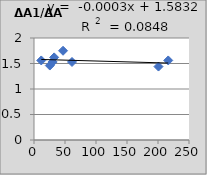
| Category | ΔA1/ΔA2 |
|---|---|
| 25.5 | 1.46 |
| 61.3 | 1.53 |
| 11.7 | 1.56 |
| 216.5 | 1.56 |
| 46.8 | 1.75 |
| 32.5 | 1.62 |
| 200.8 | 1.44 |
| 30.1 | 1.53 |